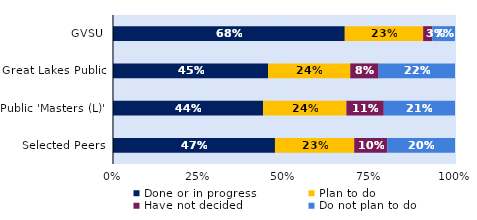
| Category | Done or in progress | Plan to do | Have not decided | Do not plan to do |
|---|---|---|---|---|
| GVSU | 0.678 | 0.229 | 0.027 | 0.066 |
| Great Lakes Public | 0.454 | 0.24 | 0.083 | 0.223 |
| Public 'Masters (L)' | 0.439 | 0.243 | 0.109 | 0.208 |
| Selected Peers | 0.474 | 0.232 | 0.097 | 0.198 |